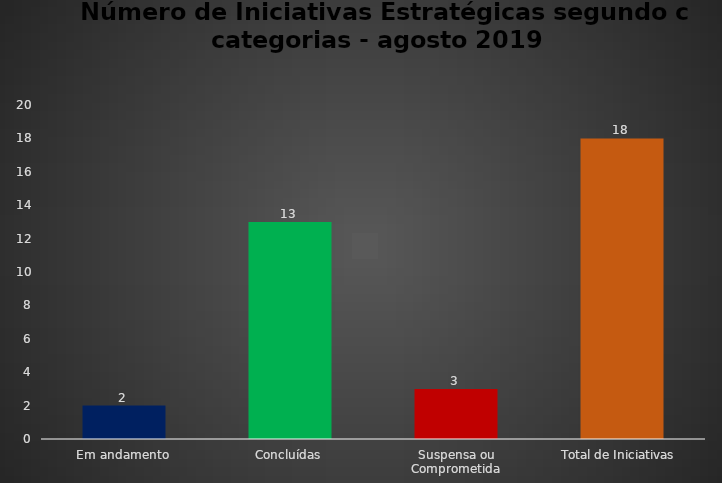
| Category | Series 0 |
|---|---|
| Em andamento | 2 |
| Concluídas | 13 |
| Suspensa ou Comprometida | 3 |
| Total de Iniciativas  | 18 |